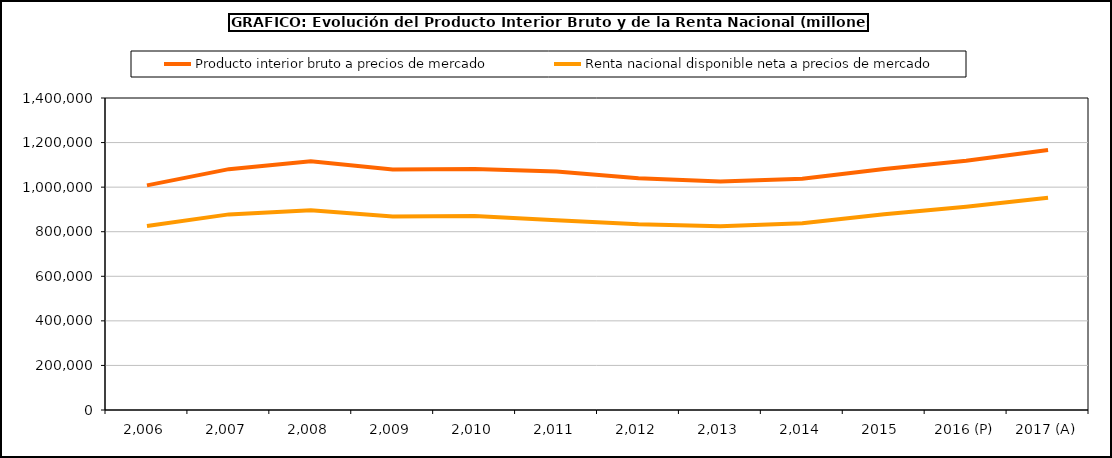
| Category | Producto interior bruto a precios de mercado | Renta nacional disponible neta a precios de mercado |
|---|---|---|
| 2,006 | 1007974 | 825737 |
| 2,007 | 1080807 | 877724 |
| 2,008 | 1116225 | 896313 |
| 2,009 | 1079052 | 867990 |
| 2,010 | 1080935 | 871037 |
| 2,011 | 1070449 | 851984 |
| 2,012 | 1039815 | 833502 |
| 2,013 | 1025693 | 824340 |
| 2,014 | 1037820 | 838041 |
| 2015  | 1081165 | 878035 |
| 2016 (P) | 1118743 | 912511 |
| 2017 (A) | 1166319 | 951924 |